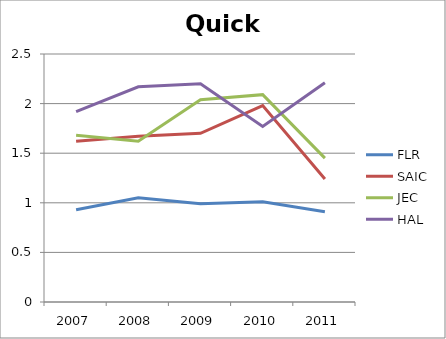
| Category | FLR | SAIC | JEC | HAL |
|---|---|---|---|---|
| 2007.0 | 0.93 | 1.62 | 1.68 | 1.92 |
| 2008.0 | 1.05 | 1.67 | 1.62 | 2.17 |
| 2009.0 | 0.99 | 1.7 | 2.04 | 2.2 |
| 2010.0 | 1.01 | 1.98 | 2.09 | 1.77 |
| 2011.0 | 0.91 | 1.24 | 1.45 | 2.21 |